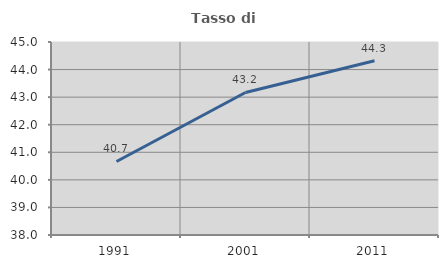
| Category | Tasso di occupazione   |
|---|---|
| 1991.0 | 40.667 |
| 2001.0 | 43.17 |
| 2011.0 | 44.318 |